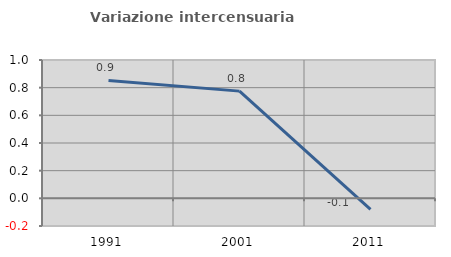
| Category | Variazione intercensuaria annua |
|---|---|
| 1991.0 | 0.852 |
| 2001.0 | 0.775 |
| 2011.0 | -0.081 |